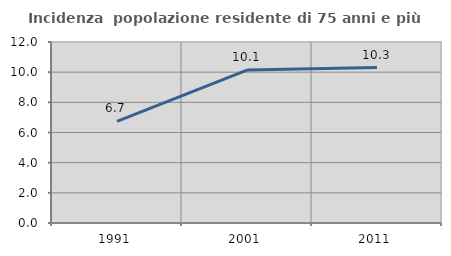
| Category | Incidenza  popolazione residente di 75 anni e più |
|---|---|
| 1991.0 | 6.737 |
| 2001.0 | 10.136 |
| 2011.0 | 10.306 |